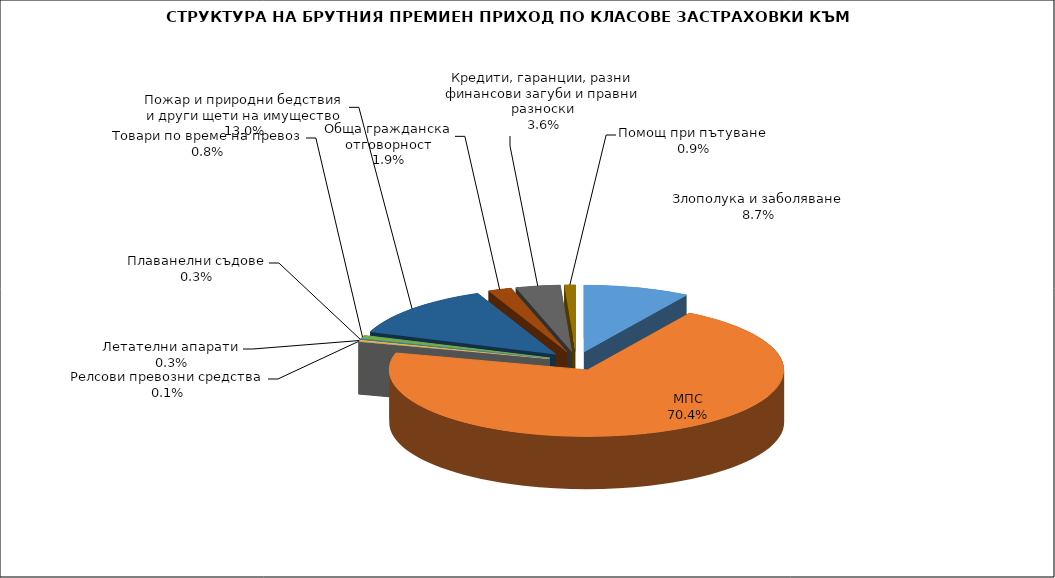
| Category | Злополука и заболяване |
|---|---|
| Злополука и заболяване | 0.087 |
| МПС | 0.704 |
| Релсови превозни средства | 0.001 |
| Летателни апарати | 0.003 |
| Плаванелни съдове | 0.003 |
| Товари по време на превоз | 0.008 |
| Пожар и природни бедствия и други щети на имущество | 0.13 |
| Обща гражданска отговорност | 0.019 |
| Кредити, гаранции, разни финансови загуби и правни разноски | 0.036 |
| Помощ при пътуване | 0.009 |